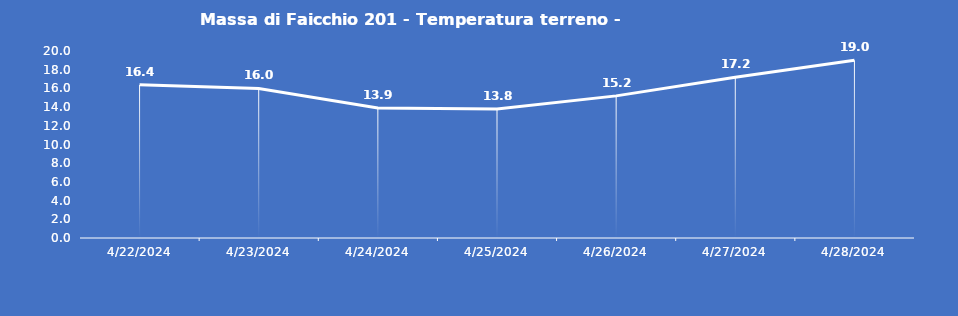
| Category | Massa di Faicchio 201 - Temperatura terreno - Grezzo (°C) |
|---|---|
| 4/22/24 | 16.4 |
| 4/23/24 | 16 |
| 4/24/24 | 13.9 |
| 4/25/24 | 13.8 |
| 4/26/24 | 15.2 |
| 4/27/24 | 17.2 |
| 4/28/24 | 19 |